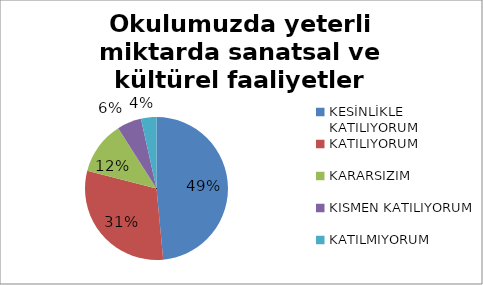
| Category | Okulumuzda yeterli miktarda sanatsal ve kültürel faaliyetler düzenlenmektedir. |
|---|---|
| KESİNLİKLE KATILIYORUM | 97 |
| KATILIYORUM | 61 |
| KARARSIZIM | 24 |
| KISMEN KATILIYORUM | 11 |
| KATILMIYORUM | 7 |